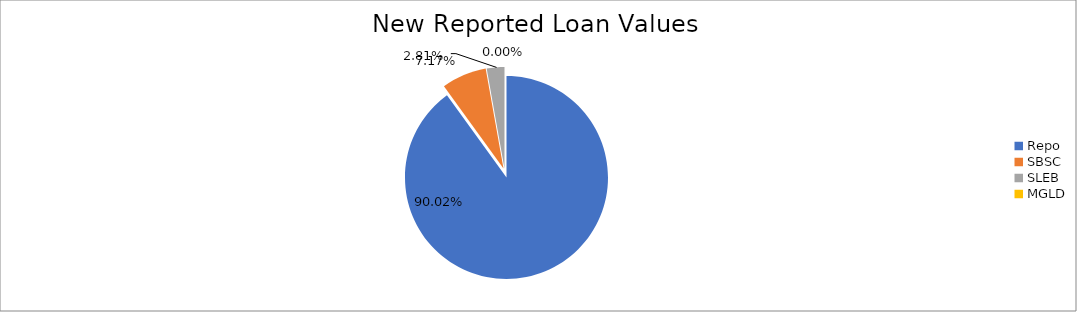
| Category | Series 0 |
|---|---|
| Repo | 11748853.908 |
| SBSC | 935497.101 |
| SLEB | 366771.543 |
| MGLD | 148.444 |